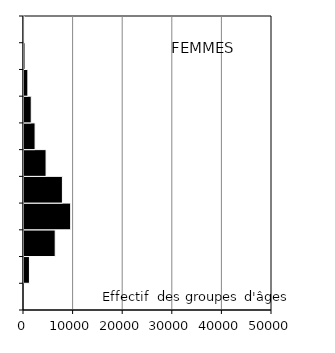
| Category | Hommes |
|---|---|
| 11-15 | 0 |
| 16-20 | 1099 |
| 21-25 | 6291 |
| 26-30 | 9410 |
| 31-35 | 7746 |
| 36-40 | 4449 |
| 41-45 | 2234 |
| 46-50 | 1459 |
| 51-55 | 781 |
| 56-60 | 202 |
| 61-65 | 9 |